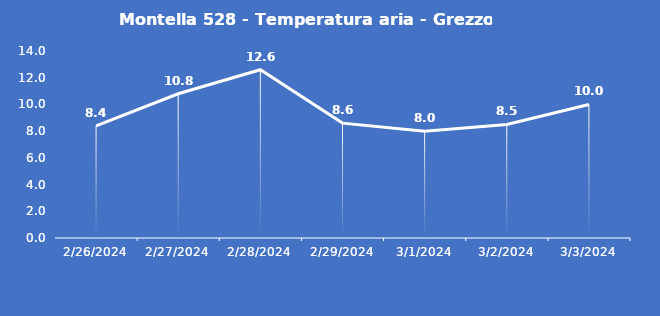
| Category | Montella 528 - Temperatura aria - Grezzo (°C) |
|---|---|
| 2/26/24 | 8.4 |
| 2/27/24 | 10.8 |
| 2/28/24 | 12.6 |
| 2/29/24 | 8.6 |
| 3/1/24 | 8 |
| 3/2/24 | 8.5 |
| 3/3/24 | 10 |